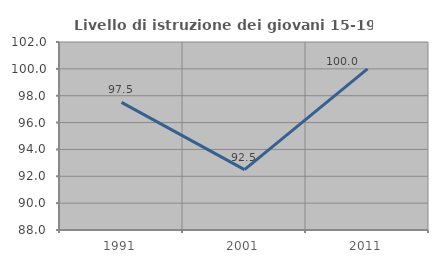
| Category | Livello di istruzione dei giovani 15-19 anni |
|---|---|
| 1991.0 | 97.5 |
| 2001.0 | 92.5 |
| 2011.0 | 100 |